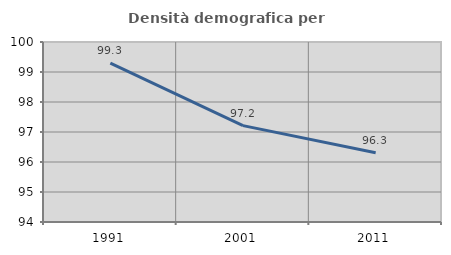
| Category | Densità demografica |
|---|---|
| 1991.0 | 99.295 |
| 2001.0 | 97.213 |
| 2011.0 | 96.309 |